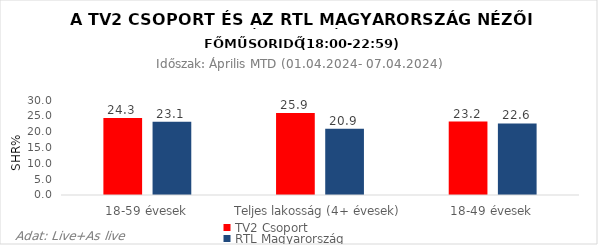
| Category | TV2 Csoport | RTL Magyarország |
|---|---|---|
| 18-59 évesek | 24.3 | 23.1 |
| Teljes lakosság (4+ évesek) | 25.9 | 20.9 |
| 18-49 évesek | 23.2 | 22.6 |